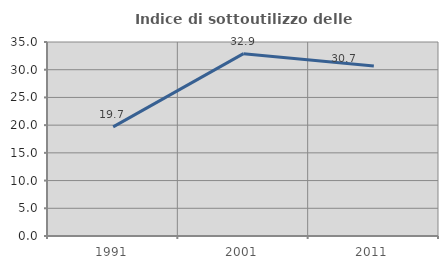
| Category | Indice di sottoutilizzo delle abitazioni  |
|---|---|
| 1991.0 | 19.681 |
| 2001.0 | 32.898 |
| 2011.0 | 30.686 |